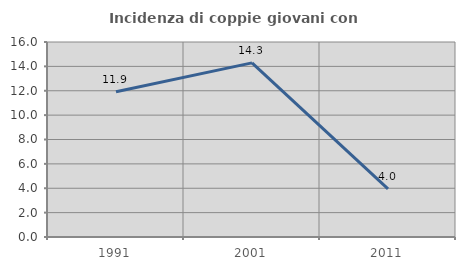
| Category | Incidenza di coppie giovani con figli |
|---|---|
| 1991.0 | 11.915 |
| 2001.0 | 14.286 |
| 2011.0 | 3.955 |